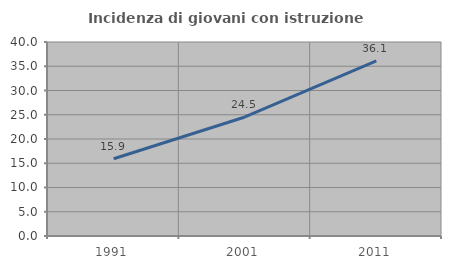
| Category | Incidenza di giovani con istruzione universitaria |
|---|---|
| 1991.0 | 15.927 |
| 2001.0 | 24.542 |
| 2011.0 | 36.121 |